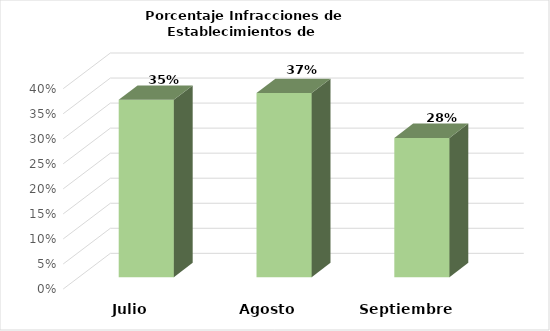
| Category | Series 0 |
|---|---|
| Julio | 0.354 |
| Agosto | 0.368 |
| Septiembre | 0.278 |